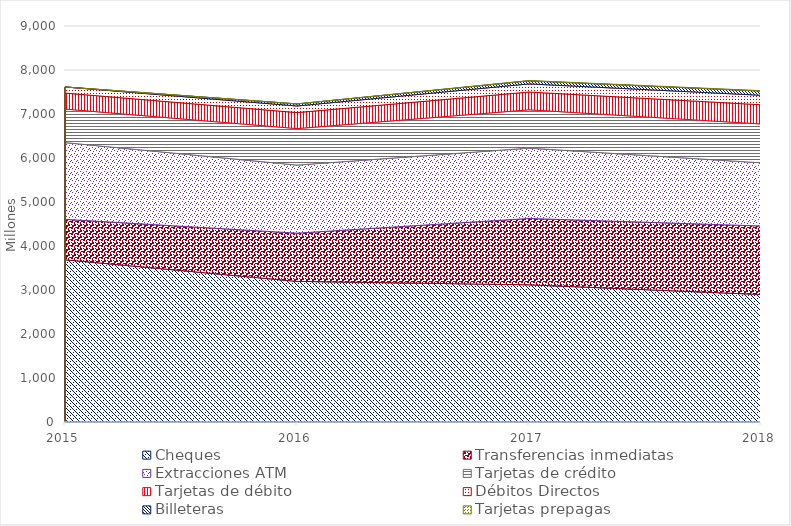
| Category | Cheques | Transferencias inmediatas | Extracciones ATM | Tarjetas de crédito | Tarjetas de débito | Débitos Directos | Billeteras | Tarjetas prepagas |
|---|---|---|---|---|---|---|---|---|
| 2015.0 | 3687.441 | 918.201 | 1744.49 | 761.503 | 364.118 | 139.24 | 0 | 0 |
| 2016.0 | 3195.884 | 1096.137 | 1547.44 | 828.933 | 363.605 | 149.902 | 47.165 | 0 |
| 2017.0 | 3117.674 | 1507.742 | 1599.077 | 871.295 | 403.304 | 185.125 | 69.428 | 6.817 |
| 2018.0 | 2897.745 | 1557.19 | 1435.908 | 882.276 | 436.992 | 215.68 | 95.194 | 10.044 |